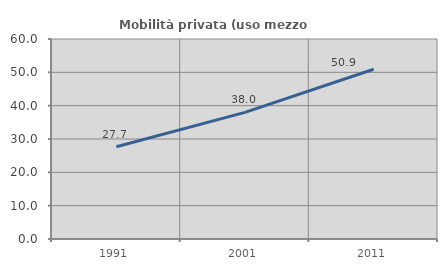
| Category | Mobilità privata (uso mezzo privato) |
|---|---|
| 1991.0 | 27.682 |
| 2001.0 | 37.995 |
| 2011.0 | 50.935 |